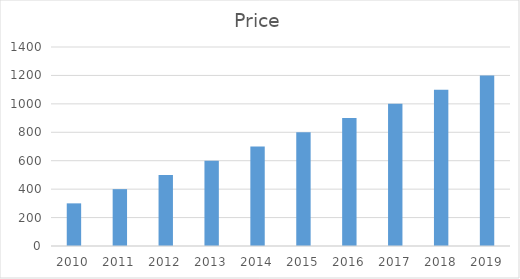
| Category | Price |
|---|---|
| 2010.0 | 300 |
| 2011.0 | 400 |
| 2012.0 | 500 |
| 2013.0 | 600 |
| 2014.0 | 700 |
| 2015.0 | 800 |
| 2016.0 | 900 |
| 2017.0 | 1000 |
| 2018.0 | 1100 |
| 2019.0 | 1200 |